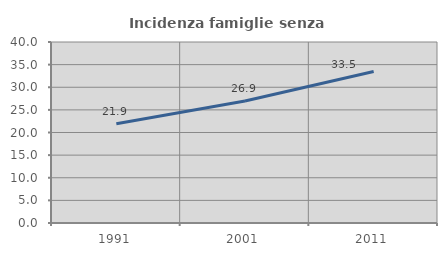
| Category | Incidenza famiglie senza nuclei |
|---|---|
| 1991.0 | 21.916 |
| 2001.0 | 26.946 |
| 2011.0 | 33.471 |